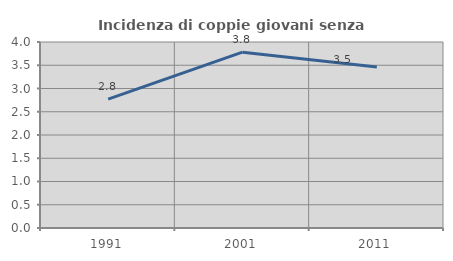
| Category | Incidenza di coppie giovani senza figli |
|---|---|
| 1991.0 | 2.771 |
| 2001.0 | 3.78 |
| 2011.0 | 3.464 |